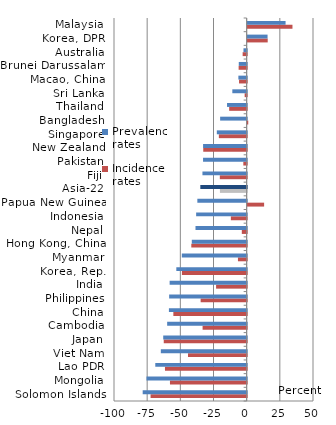
| Category | Incidence rates | Prevalence rates |
|---|---|---|
| Solomon Islands | -72.436 | -78.374 |
| Mongolia | -57.816 | -75.512 |
| Lao PDR | -61.585 | -68.88 |
| Viet Nam | -44.223 | -64.706 |
| Japan | -62.5 | -62.903 |
| Cambodia | -33.219 | -59.928 |
| China | -55.263 | -58.605 |
| Philippines | -34.694 | -58.425 |
| India | -23.041 | -58.065 |
| Korea, Rep. | -48.81 | -53.023 |
| Myanmar | -6.582 | -48.881 |
| Hong Kong, China | -41.732 | -41.358 |
| Nepal | -3.659 | -38.571 |
| Indonesia | -11.921 | -38.086 |
| Papua New Guinea | 12.399 | -37.173 |
| Asia-22 | -20.155 | -34.936 |
| Fiji | -20.238 | -33.333 |
| Pakistan | -2.527 | -32.874 |
| New Zealand | -32.727 | -32.857 |
| Singapore | -20.968 | -22.5 |
| Bangladesh | 0.442 | -20 |
| Thailand | -13.198 | -14.801 |
| Sri Lanka | -1.515 | -10.811 |
| Macao, China | -5.747 | -6.25 |
| Brunei Darussalam | -6.061 | -5.952 |
| Australia | -3.03 | -2.41 |
| Korea, DPR | 15.104 | 15 |
| Malaysia | 33.766 | 28.571 |